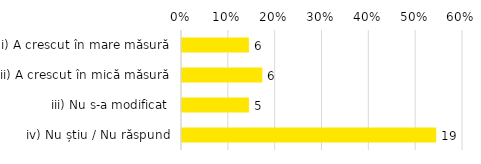
| Category | Total |
|---|---|
| i) A crescut în mare măsură | 0.143 |
| ii) A crescut în mică măsură | 0.171 |
| iii) Nu s-a modificat | 0.143 |
| iv) Nu știu / Nu răspund | 0.543 |